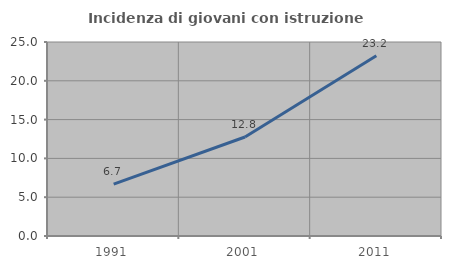
| Category | Incidenza di giovani con istruzione universitaria |
|---|---|
| 1991.0 | 6.675 |
| 2001.0 | 12.755 |
| 2011.0 | 23.22 |